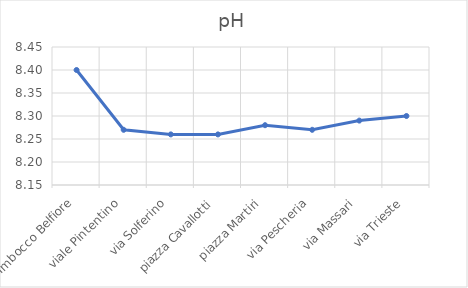
| Category |  pH |
|---|---|
| Imbocco Belfiore | 8.4 |
| viale Pintentino | 8.27 |
| via Solferino | 8.26 |
| piazza Cavallotti | 8.26 |
| piazza Martiri | 8.28 |
| via Pescheria | 8.27 |
| via Massari | 8.29 |
| via Trieste | 8.3 |